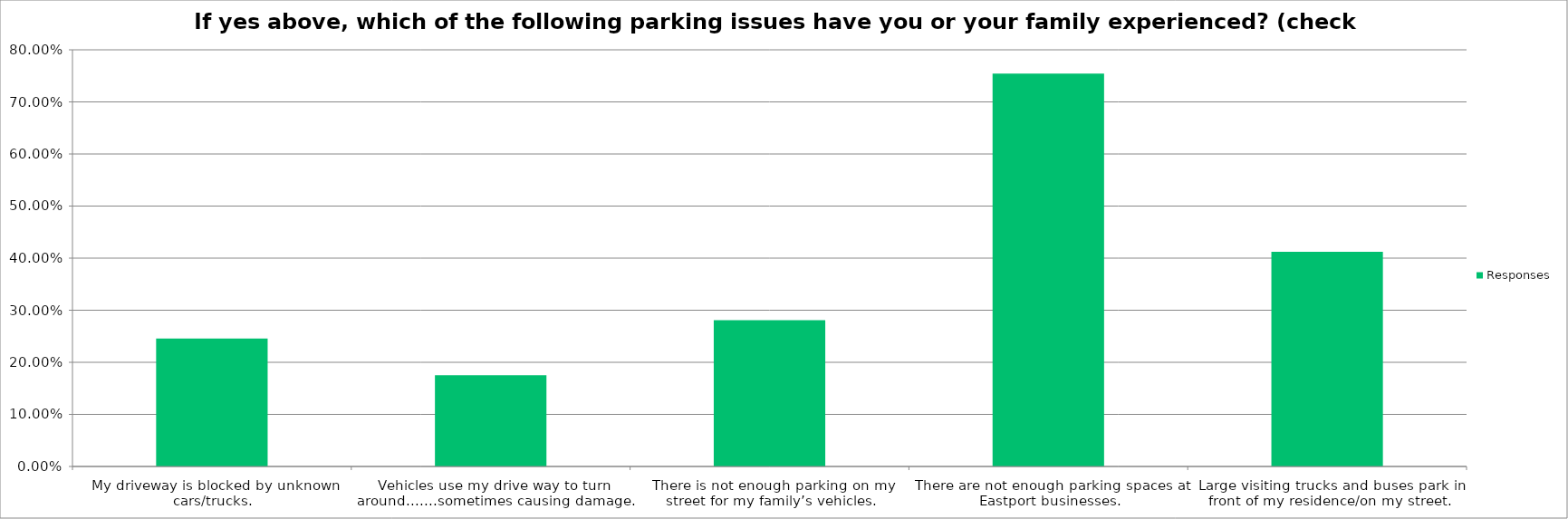
| Category | Responses |
|---|---|
| My driveway is blocked by unknown cars/trucks. | 0.246 |
| Vehicles use my drive way to turn around.......sometimes causing damage. | 0.175 |
| There is not enough parking on my street for my family’s vehicles. | 0.281 |
| There are not enough parking spaces at Eastport businesses. | 0.754 |
| Large visiting trucks and buses park in front of my residence/on my street. | 0.412 |